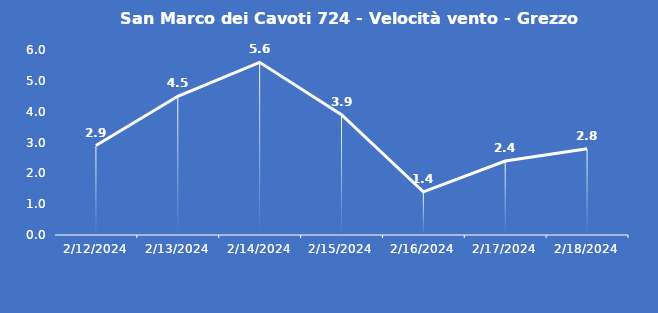
| Category | San Marco dei Cavoti 724 - Velocità vento - Grezzo (m/s) |
|---|---|
| 2/12/24 | 2.9 |
| 2/13/24 | 4.5 |
| 2/14/24 | 5.6 |
| 2/15/24 | 3.9 |
| 2/16/24 | 1.4 |
| 2/17/24 | 2.4 |
| 2/18/24 | 2.8 |